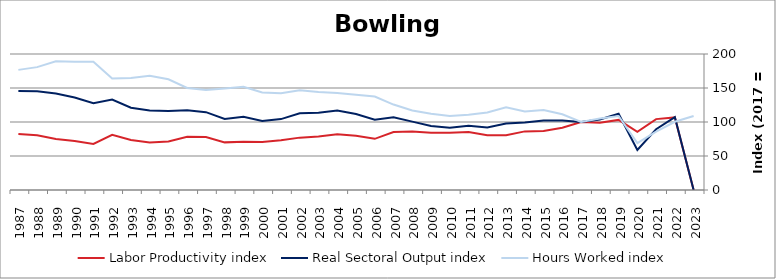
| Category | Labor Productivity index | Real Sectoral Output index | Hours Worked index |
|---|---|---|---|
| 2023.0 | 0 | 0 | 108.892 |
| 2022.0 | 106.731 | 107.101 | 100.347 |
| 2021.0 | 104.252 | 89.337 | 85.693 |
| 2020.0 | 85.544 | 58.925 | 68.883 |
| 2019.0 | 103.104 | 112.132 | 108.756 |
| 2018.0 | 98.763 | 103.729 | 105.028 |
| 2017.0 | 100 | 100 | 100 |
| 2016.0 | 91.566 | 102.031 | 111.429 |
| 2015.0 | 86.862 | 102.239 | 117.702 |
| 2014.0 | 86.202 | 99.402 | 115.313 |
| 2013.0 | 80.442 | 97.788 | 121.563 |
| 2012.0 | 80.679 | 91.939 | 113.957 |
| 2011.0 | 85.242 | 94.367 | 110.705 |
| 2010.0 | 84.129 | 91.494 | 108.755 |
| 2009.0 | 84.012 | 94.092 | 111.999 |
| 2008.0 | 86.011 | 100.535 | 116.887 |
| 2007.0 | 85.166 | 107.003 | 125.64 |
| 2006.0 | 75.236 | 103.455 | 137.507 |
| 2005.0 | 79.741 | 111.763 | 140.157 |
| 2004.0 | 81.9 | 116.778 | 142.586 |
| 2003.0 | 78.747 | 113.486 | 144.115 |
| 2002.0 | 77.012 | 112.827 | 146.507 |
| 2001.0 | 73.29 | 104.283 | 142.288 |
| 2000.0 | 70.692 | 101.375 | 143.405 |
| 1999.0 | 70.907 | 107.682 | 151.863 |
| 1998.0 | 70.039 | 104.52 | 149.232 |
| 1997.0 | 77.897 | 114.513 | 147.006 |
| 1996.0 | 78.248 | 117.37 | 149.998 |
| 1995.0 | 71.439 | 116.32 | 162.824 |
| 1994.0 | 69.69 | 117.017 | 167.911 |
| 1993.0 | 73.429 | 120.952 | 164.719 |
| 1992.0 | 81.17 | 133.134 | 164.019 |
| 1991.0 | 67.625 | 127.581 | 188.659 |
| 1990.0 | 72.088 | 136.012 | 188.675 |
| 1989.0 | 74.922 | 141.871 | 189.358 |
| 1988.0 | 80.382 | 145.235 | 180.68 |
| 1987.0 | 82.342 | 145.457 | 176.65 |